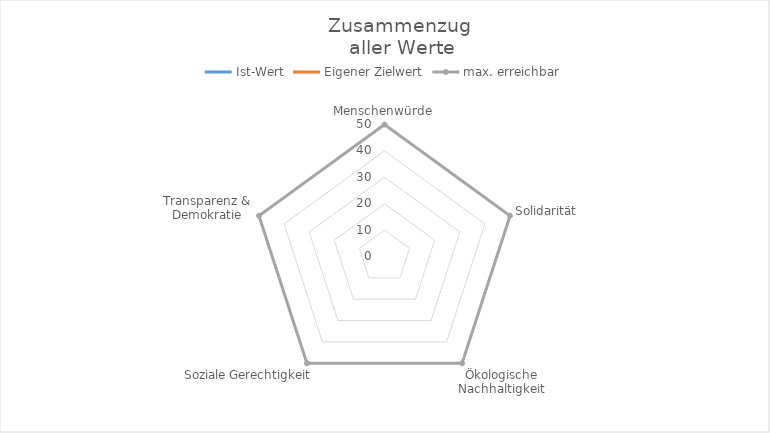
| Category | Ist-Wert | Eigener Zielwert | max. erreichbar |
|---|---|---|---|
| Menschenwürde | 0 | 0 | 50 |
| Solidarität | 0 | 0 | 50 |
| Ökologische Nachhaltigkeit | 0 | 0 | 50 |
| Soziale Gerechtigkeit | 0 | 0 | 50 |
| Transparenz & Demokratie | 0 | 0 | 50 |